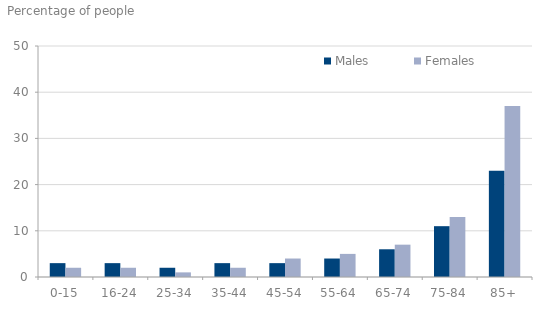
| Category | Males | Females |
|---|---|---|
| 0 | 3 | 2 |
| 1 | 3 | 2 |
| 2 | 2 | 1 |
| 3 | 3 | 2 |
| 4 | 3 | 4 |
| 5 | 4 | 5 |
| 6 | 6 | 7 |
| 7 | 11 | 13 |
| 8 | 23 | 37 |